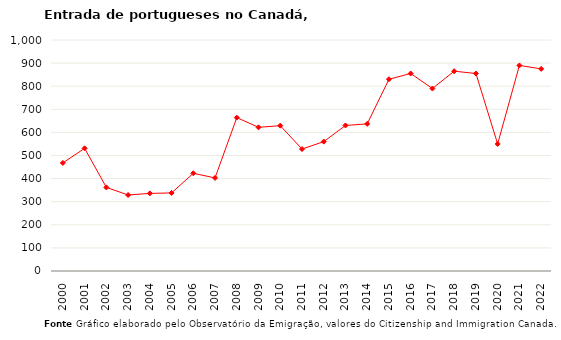
| Category | Entradas |
|---|---|
| 2000.0 | 468 |
| 2001.0 | 531 |
| 2002.0 | 362 |
| 2003.0 | 329 |
| 2004.0 | 336 |
| 2005.0 | 338 |
| 2006.0 | 423 |
| 2007.0 | 403 |
| 2008.0 | 664 |
| 2009.0 | 622 |
| 2010.0 | 629 |
| 2011.0 | 528 |
| 2012.0 | 560 |
| 2013.0 | 630 |
| 2014.0 | 637 |
| 2015.0 | 830 |
| 2016.0 | 855 |
| 2017.0 | 790 |
| 2018.0 | 865 |
| 2019.0 | 855 |
| 2020.0 | 550 |
| 2021.0 | 890 |
| 2022.0 | 875 |